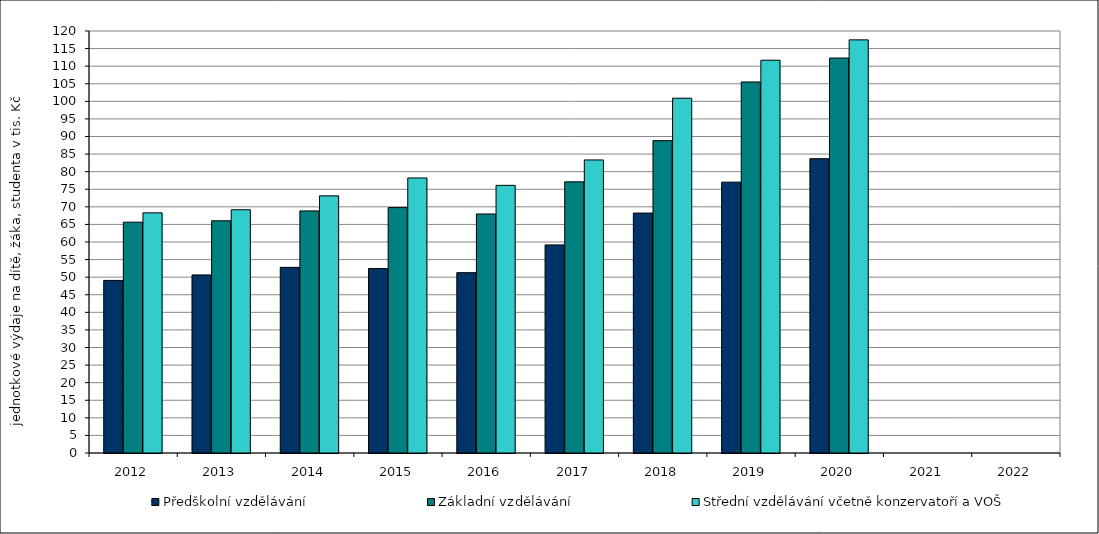
| Category | Předškolní vzdělávání | Základní vzdělávání | Střední vzdělávání včetně konzervatoří a VOŠ |
|---|---|---|---|
| 2012.0 | 49.077 | 65.637 | 68.289 |
| 2013.0 | 50.642 | 66.027 | 69.167 |
| 2014.0 | 52.788 | 68.84 | 73.118 |
| 2015.0 | 52.455 | 69.776 | 78.212 |
| 2016.0 | 51.282 | 67.97 | 76.108 |
| 2017.0 | 59.173 | 77.105 | 83.332 |
| 2018.0 | 68.222 | 88.809 | 100.887 |
| 2019.0 | 77.018 | 105.515 | 111.689 |
| 2020.0 | 83.686 | 112.306 | 117.478 |
| 2021.0 | 0 | 0 | 0 |
| 2022.0 | 0 | 0 | 0 |